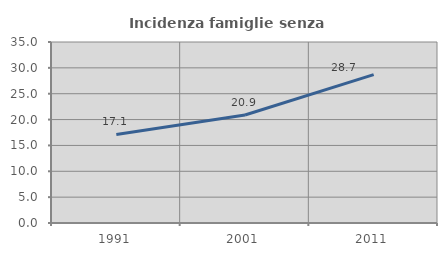
| Category | Incidenza famiglie senza nuclei |
|---|---|
| 1991.0 | 17.123 |
| 2001.0 | 20.878 |
| 2011.0 | 28.695 |